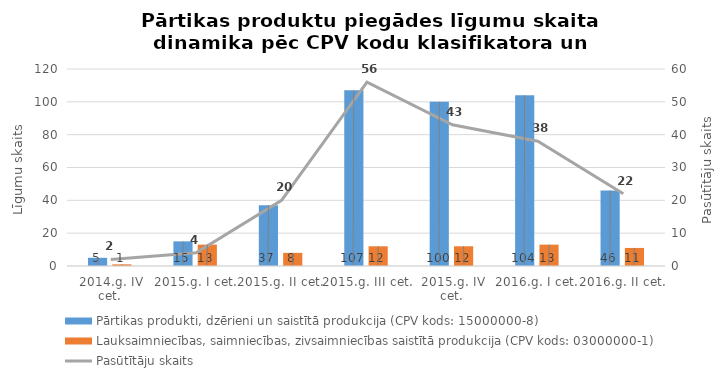
| Category | Pārtikas produkti, dzērieni un saistītā produkcija (CPV kods: 15000000-8) | Lauksaimniecības, saimniecības, zivsaimniecības saistītā produkcija (CPV kods: 03000000-1) |
|---|---|---|
| 2014.g. IV cet. | 5 | 1 |
| 2015.g. I cet. | 15 | 13 |
| 2015.g. II cet. | 37 | 8 |
| 2015.g. III cet. | 107 | 12 |
| 2015.g. IV cet. | 100 | 12 |
| 2016.g. I cet. | 104 | 13 |
| 2016.g. II cet. | 46 | 11 |